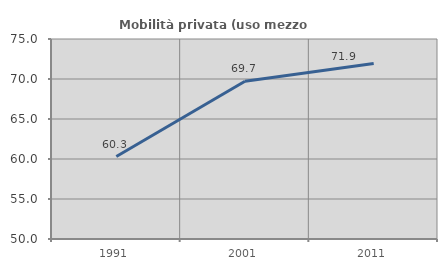
| Category | Mobilità privata (uso mezzo privato) |
|---|---|
| 1991.0 | 60.312 |
| 2001.0 | 69.718 |
| 2011.0 | 71.93 |